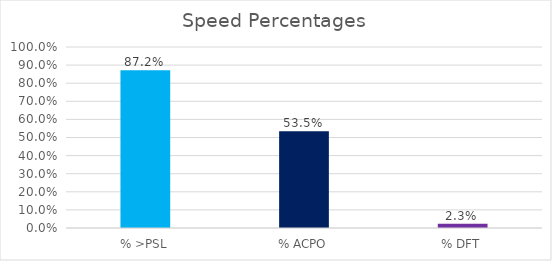
| Category | Series 0 |
|---|---|
| % >PSL | 0.872 |
| % ACPO | 0.535 |
| % DFT | 0.023 |